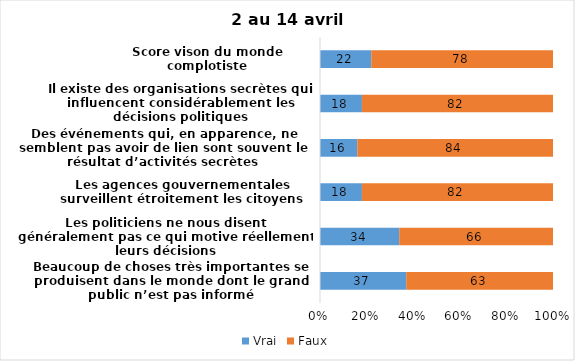
| Category | Vrai | Faux |
|---|---|---|
| Beaucoup de choses très importantes se produisent dans le monde dont le grand public n’est pas informé | 37 | 63 |
| Les politiciens ne nous disent généralement pas ce qui motive réellement leurs décisions | 34 | 66 |
| Les agences gouvernementales surveillent étroitement les citoyens | 18 | 82 |
| Des événements qui, en apparence, ne semblent pas avoir de lien sont souvent le résultat d’activités secrètes | 16 | 84 |
| Il existe des organisations secrètes qui influencent considérablement les décisions politiques | 18 | 82 |
| Score vison du monde complotiste | 22 | 78 |